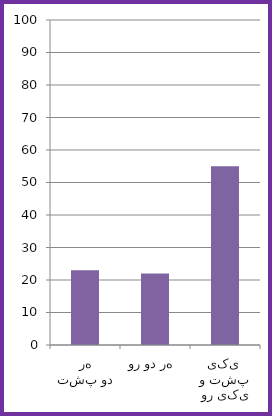
| Category | Series 0 |
|---|---|
| هر دو پشت | 23 |
| هر دو رو  | 22 |
| یکی پشت و یکی رو  | 55 |